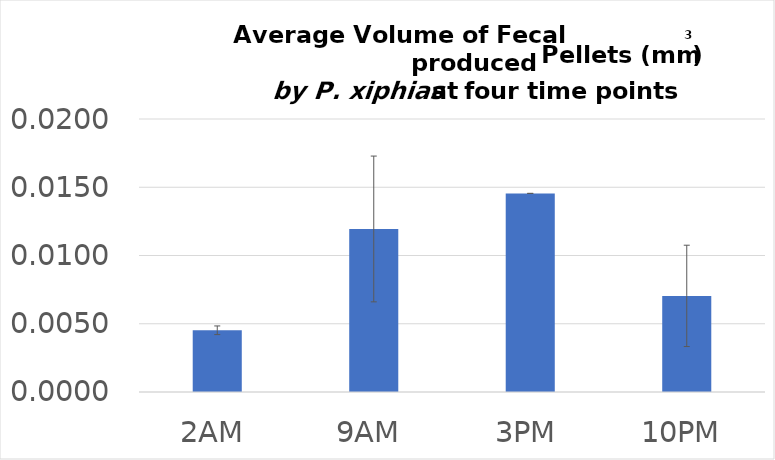
| Category | Fecal Pellet Volume |
|---|---|
| 2AM | 0.005 |
| 9AM | 0.012 |
| 3PM | 0.015 |
| 10PM | 0.007 |